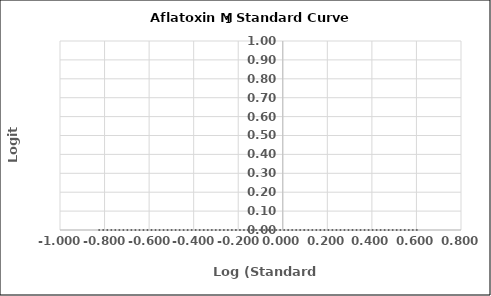
| Category | Series 0 |
|---|---|
| -0.8239087409443188 | 0 |
| -0.3979400086720376 | 0 |
| -0.09691001300805639 | 0 |
| 0.17609125905568124 | 0 |
| 0.6020599913279624 | 0 |